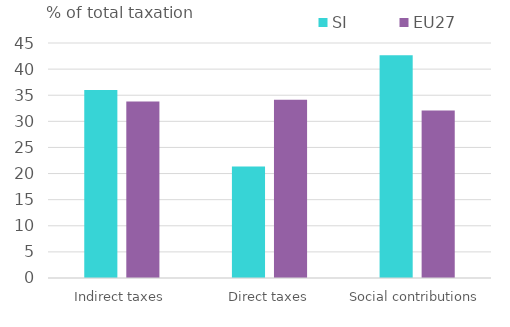
| Category | SI | EU27 |
|---|---|---|
| Indirect taxes | 35.993 | 33.811 |
| Direct taxes | 21.332 | 34.133 |
| Social contributions | 42.675 | 32.056 |